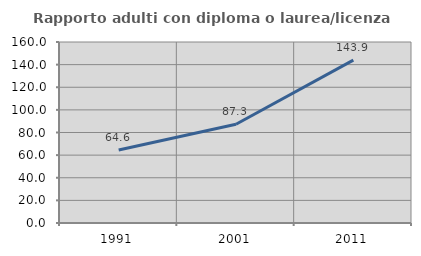
| Category | Rapporto adulti con diploma o laurea/licenza media  |
|---|---|
| 1991.0 | 64.583 |
| 2001.0 | 87.333 |
| 2011.0 | 143.936 |